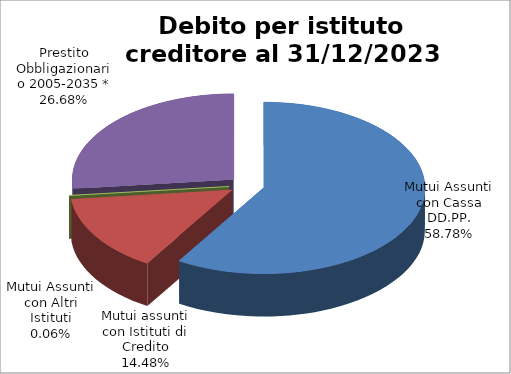
| Category | Series 2 |
|---|---|
| Mutui Assunti con Cassa DD.PP. | 2021.469 |
| Mutui assunti con Istituti di Credito | 497.788 |
| Mutui Assunti con Altri Istituti | 2.045 |
| Prestito Obbligazionario 2005-2035 * | 917.597 |